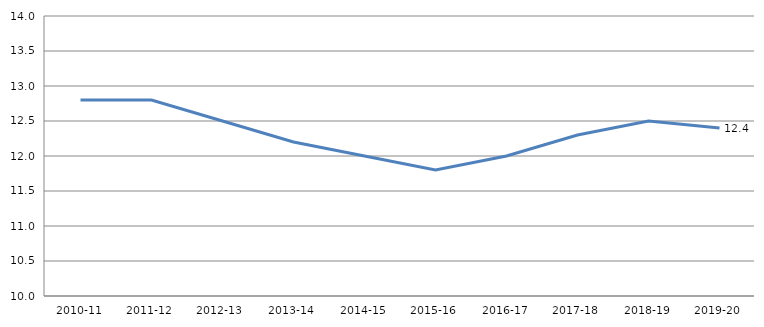
| Category | Series 0 |
|---|---|
| 2010-11 | 12.8 |
| 2011-12 | 12.8 |
| 2012-13  | 12.5 |
| 2013-14 | 12.2 |
| 2014-15 | 12 |
| 2015-16 | 11.8 |
| 2016-17 | 12 |
| 2017-18 | 12.3 |
| 2018-19 | 12.5 |
| 2019-20 | 12.4 |